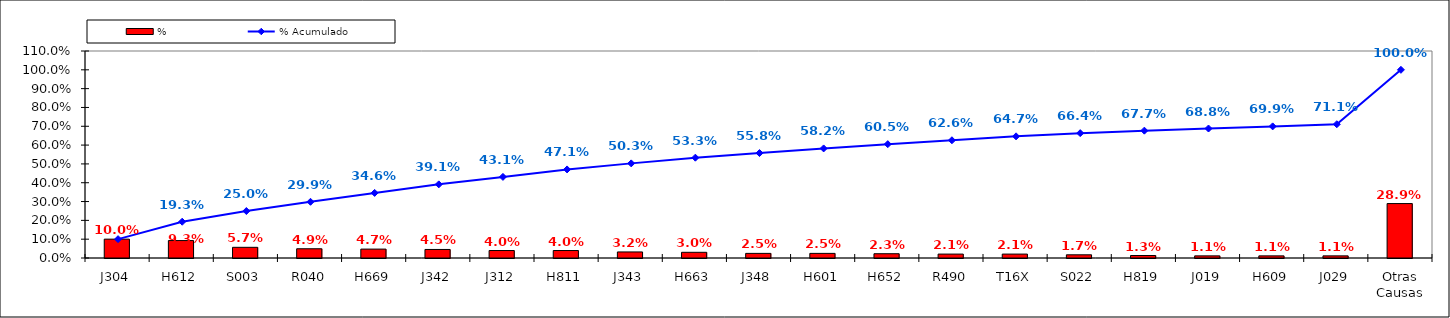
| Category | % |
|---|---|
| J304 | 0.1 |
| H612 | 0.093 |
| S003 | 0.057 |
| R040 | 0.049 |
| H669 | 0.047 |
| J342 | 0.045 |
| J312 | 0.04 |
| H811 | 0.04 |
| J343 | 0.032 |
| H663 | 0.03 |
| J348 | 0.025 |
| H601 | 0.025 |
| H652 | 0.023 |
| R490 | 0.021 |
| T16X | 0.021 |
| S022 | 0.017 |
| H819 | 0.013 |
| J019 | 0.011 |
| H609 | 0.011 |
| J029 | 0.011 |
| Otras Causas | 0.289 |